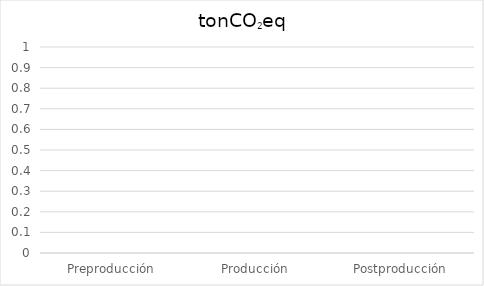
| Category | tonCO2eq |
|---|---|
| Preproducción | 0 |
| Producción | 0 |
| Postproducción | 0 |